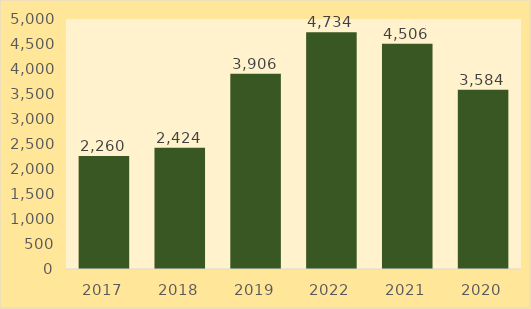
| Category | Sipërfaqe mesatare për leje ndërtimi m2 |
|---|---|
| 2017.0 | 2259.723 |
| 2018.0 | 2423.577 |
| 2019.0 | 3905.705 |
| 2022.0 | 4733.95 |
| 2021.0 | 4505.825 |
| 2020.0 | 3583.776 |